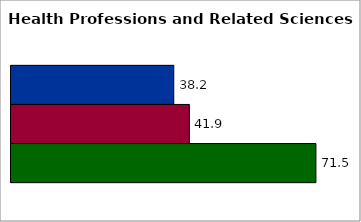
| Category | 50 states and D.C. | SREB states | State |
|---|---|---|---|
| 0 | 38.182 | 41.855 | 71.534 |